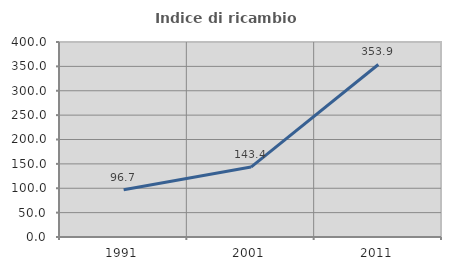
| Category | Indice di ricambio occupazionale  |
|---|---|
| 1991.0 | 96.723 |
| 2001.0 | 143.431 |
| 2011.0 | 353.864 |